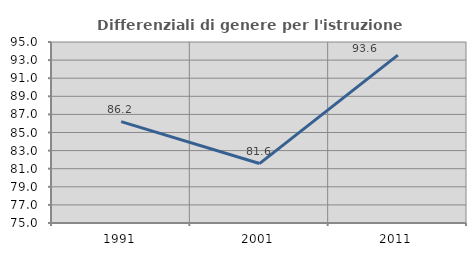
| Category | Differenziali di genere per l'istruzione superiore |
|---|---|
| 1991.0 | 86.201 |
| 2001.0 | 81.568 |
| 2011.0 | 93.557 |